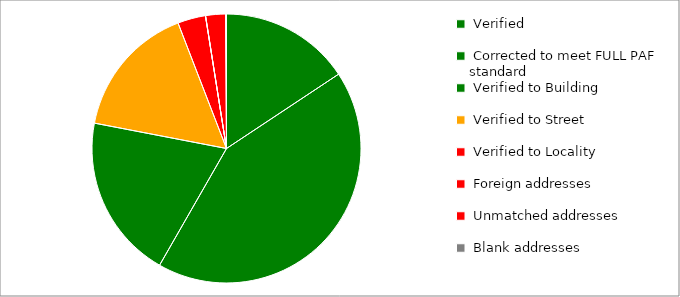
| Category | Series 0 |
|---|---|
|  Verified  | 1593 |
|  Corrected to meet FULL PAF standard  | 4329 |
|  Verified to Building  | 2005 |
|  Verified to Street  | 1637 |
|  Verified to Locality  | 341 |
|  Foreign addresses  | 2 |
|  Unmatched addresses  | 243 |
|  Blank addresses  | 10 |